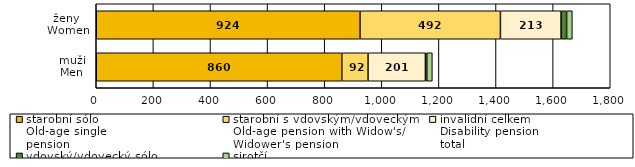
| Category | starobní sólo
Old-age single
pension | starobní s vdovským/vdoveckým
Old-age pension with Widow's/
Widower's pension
 | invalidní celkem
Disability pension
total | vdovský/vdovecký sólo
Widow's/Widower's
single pension | sirotčí
Orphan
pension |
|---|---|---|---|---|---|
| muži
Men | 859.909 | 91.852 | 200.98 | 4.772 | 19.416 |
| ženy 
Women | 923.643 | 491.781 | 212.533 | 19.259 | 20.035 |